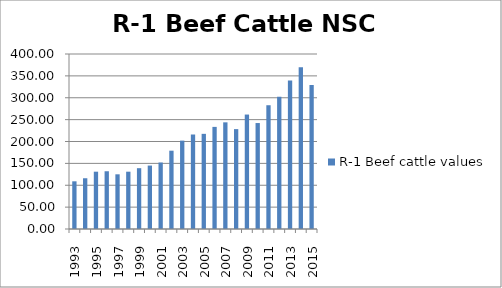
| Category | R-1 Beef cattle values |
|---|---|
| 1993.0 | 109 |
| 1994.0 | 116 |
| 1995.0 | 131 |
| 1996.0 | 132 |
| 1997.0 | 125 |
| 1998.0 | 131 |
| 1999.0 | 139 |
| 2000.0 | 145 |
| 2001.0 | 152 |
| 2002.0 | 179 |
| 2003.0 | 202 |
| 2004.0 | 216 |
| 2005.0 | 217.5 |
| 2006.0 | 233.4 |
| 2007.0 | 243.8 |
| 2008.0 | 228.3 |
| 2009.0 | 261.6 |
| 2010.0 | 242.2 |
| 2011.0 | 282.9 |
| 2012.0 | 302.1 |
| 2013.0 | 339.2 |
| 2014.0 | 369.7 |
| 2015.0 | 329.1 |